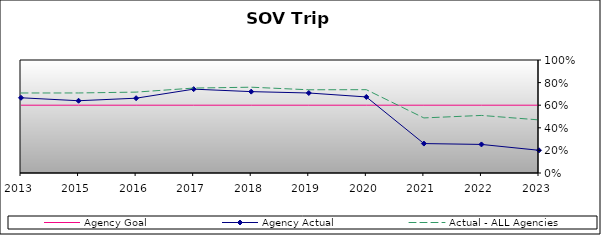
| Category | Agency Goal | Agency Actual | Actual - ALL Agencies |
|---|---|---|---|
| 2013.0 | 0.6 | 0.666 | 0.708 |
| 2015.0 | 0.6 | 0.639 | 0.708 |
| 2016.0 | 0.6 | 0.662 | 0.716 |
| 2017.0 | 0.6 | 0.742 | 0.752 |
| 2018.0 | 0.6 | 0.72 | 0.759 |
| 2019.0 | 0.6 | 0.708 | 0.736 |
| 2020.0 | 0.6 | 0.673 | 0.737 |
| 2021.0 | 0.6 | 0.26 | 0.487 |
| 2022.0 | 0.6 | 0.253 | 0.509 |
| 2023.0 | 0.6 | 0.201 | 0.47 |